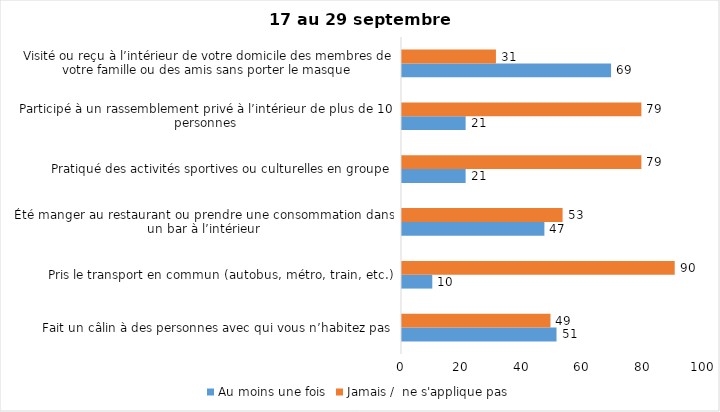
| Category | Au moins une fois | Jamais /  ne s'applique pas |
|---|---|---|
| Fait un câlin à des personnes avec qui vous n’habitez pas | 51 | 49 |
| Pris le transport en commun (autobus, métro, train, etc.) | 10 | 90 |
| Été manger au restaurant ou prendre une consommation dans un bar à l’intérieur | 47 | 53 |
| Pratiqué des activités sportives ou culturelles en groupe | 21 | 79 |
| Participé à un rassemblement privé à l’intérieur de plus de 10 personnes | 21 | 79 |
| Visité ou reçu à l’intérieur de votre domicile des membres de votre famille ou des amis sans porter le masque | 69 | 31 |